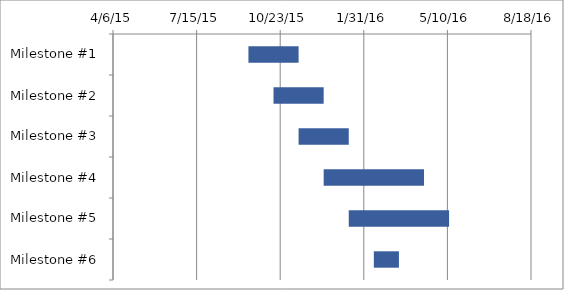
| Category | Start Date | Duration |
|---|---|---|
| Milestone #1 | 9/15/15 | 60 |
| Milestone #2 | 10/15/15 | 60 |
| Milestone #3 | 11/14/15 | 60 |
| Milestone #4 | 12/14/15 | 120 |
| Milestone #5 | 1/13/16 | 120 |
| Milestone #6 | 2/12/16 | 30 |